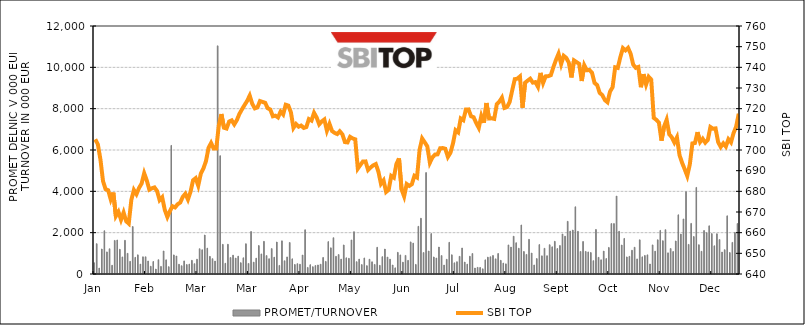
| Category | PROMET/TURNOVER |
|---|---|
| 2016-01-04 | 547 |
| 2016-01-05 | 1467 |
| 2016-01-06 | 286 |
| 2016-01-07 | 1211 |
| 2016-01-08 | 2095 |
| 2016-01-11 | 1070 |
| 2016-01-12 | 1221 |
| 2016-01-13 | 424 |
| 2016-01-14 | 1624 |
| 2016-01-15 | 1646 |
| 2016-01-18 | 1197 |
| 2016-01-19 | 827 |
| 2016-01-20 | 1630 |
| 2016-01-21 | 999 |
| 2016-01-22 | 612 |
| 2016-01-25 | 2298 |
| 2016-01-26 | 805 |
| 2016-01-27 | 927 |
| 2016-01-28 | 478 |
| 2016-01-29 | 833 |
| 2016-02-01 | 832 |
| 2016-02-02 | 630 |
| 2016-02-03 | 375 |
| 2016-02-04 | 604 |
| 2016-02-05 | 239 |
| 2016-02-09 | 692 |
| 2016-02-10 | 368 |
| 2016-02-11 | 1114 |
| 2016-02-12 | 686 |
| 2016-02-15 | 356 |
| 2016-02-16 | 6221 |
| 2016-02-17 | 924 |
| 2016-02-18 | 871 |
| 2016-02-19 | 473 |
| 2016-02-22 | 400 |
| 2016-02-23 | 634 |
| 2016-02-24 | 457 |
| 2016-02-25 | 479 |
| 2016-02-26 | 662 |
| 2016-02-29 | 500 |
| 2016-03-01 | 717 |
| 2016-03-02 | 1223 |
| 2016-03-03 | 1173 |
| 2016-03-04 | 1887 |
| 2016-03-07 | 1252 |
| 2016-03-08 | 853 |
| 2016-03-09 | 743 |
| 2016-03-10 | 625 |
| 2016-03-11 | 11040 |
| 2016-03-14 | 5723 |
| 2016-03-15 | 1435 |
| 2016-03-16 | 519 |
| 2016-03-17 | 1440 |
| 2016-03-18 | 798 |
| 2016-03-21 | 913 |
| 2016-03-22 | 770 |
| 2016-03-23 | 864 |
| 2016-03-24 | 548 |
| 2016-03-29 | 784 |
| 2016-03-30 | 1465 |
| 2016-03-31 | 511 |
| 2016-04-01 | 2057 |
| 2016-04-04 | 574 |
| 2016-04-05 | 767 |
| 2016-04-06 | 1377 |
| 2016-04-07 | 972 |
| 2016-04-08 | 1580 |
| 2016-04-11 | 891 |
| 2016-04-12 | 739 |
| 2016-04-13 | 1229 |
| 2016-04-14 | 812 |
| 2016-04-15 | 1549 |
| 2016-04-18 | 416 |
| 2016-04-19 | 1605 |
| 2016-04-20 | 640 |
| 2016-04-21 | 826 |
| 2016-04-22 | 1526 |
| 2016-04-25 | 734 |
| 2016-04-26 | 461 |
| 2016-04-28 | 501 |
| 2016-04-29 | 472 |
| 2016-05-03 | 918 |
| 2016-05-04 | 2141 |
| 2016-05-05 | 319 |
| 2016-05-06 | 451 |
| 2016-05-09 | 354 |
| 2016-05-10 | 410 |
| 2016-05-11 | 437 |
| 2016-05-12 | 473 |
| 2016-05-13 | 800 |
| 2016-05-16 | 610 |
| 2016-05-17 | 1567 |
| 2016-05-18 | 1267 |
| 2016-05-19 | 1756 |
| 2016-05-20 | 855 |
| 2016-05-23 | 940 |
| 2016-05-24 | 721 |
| 2016-05-25 | 1406 |
| 2016-05-26 | 784 |
| 2016-05-27 | 759 |
| 2016-05-30 | 1647 |
| 2016-05-31 | 2048 |
| 2016-06-01 | 597 |
| 2016-06-02 | 721 |
| 2016-06-03 | 455 |
| 2016-06-06 | 777 |
| 2016-06-07 | 405 |
| 2016-06-08 | 714 |
| 2016-06-09 | 590 |
| 2016-06-10 | 464 |
| 2016-06-13 | 1293 |
| 2016-06-14 | 419 |
| 2016-06-15 | 838 |
| 2016-06-16 | 1207 |
| 2016-06-17 | 820 |
| 2016-06-20 | 718 |
| 2016-06-21 | 436 |
| 2016-06-22 | 297 |
| 2016-06-23 | 1048 |
| 2016-06-24 | 923 |
| 2016-06-27 | 573 |
| 2016-06-28 | 900 |
| 2016-06-29 | 660 |
| 2016-06-30 | 1554 |
| 2016-07-01 | 1493 |
| 2016-07-04 | 464 |
| 2016-07-05 | 2307 |
| 2016-07-06 | 2698 |
| 2016-07-07 | 1037 |
| 2016-07-08 | 4907 |
| 2016-07-11 | 1113 |
| 2016-07-12 | 1954 |
| 2016-07-13 | 825 |
| 2016-07-14 | 773 |
| 2016-07-15 | 1304 |
| 2016-07-18 | 891 |
| 2016-07-19 | 433 |
| 2016-07-20 | 712 |
| 2016-07-21 | 1533 |
| 2016-07-22 | 930 |
| 2016-07-25 | 541 |
| 2016-07-26 | 594 |
| 2016-07-27 | 855 |
| 2016-07-28 | 1259 |
| 2016-07-29 | 577 |
| 2016-08-01 | 476 |
| 2016-08-02 | 859 |
| 2016-08-03 | 991 |
| 2016-08-04 | 290 |
| 2016-08-05 | 322 |
| 2016-08-08 | 317 |
| 2016-08-09 | 250 |
| 2016-08-10 | 685 |
| 2016-08-11 | 816 |
| 2016-08-12 | 835 |
| 2016-08-16 | 897 |
| 2016-08-17 | 732 |
| 2016-08-18 | 992 |
| 2016-08-19 | 661 |
| 2016-08-22 | 528 |
| 2016-08-23 | 490 |
| 2016-08-24 | 1407 |
| 2016-08-25 | 1301 |
| 2016-08-26 | 1827 |
| 2016-08-29 | 1513 |
| 2016-08-30 | 1247 |
| 2016-08-31 | 2372 |
| 2016-09-01 | 1089 |
| 2016-09-02 | 948 |
| 2016-09-05 | 1677 |
| 2016-09-06 | 1014 |
| 2016-09-07 | 437 |
| 2016-09-08 | 747 |
| 2016-09-09 | 1423 |
| 2016-09-12 | 879 |
| 2016-09-13 | 1243 |
| 2016-09-14 | 884 |
| 2016-09-15 | 1418 |
| 2016-09-16 | 1315 |
| 2016-09-19 | 1582 |
| 2016-09-20 | 1232 |
| 2016-09-21 | 1378 |
| 2016-09-22 | 1936 |
| 2016-09-23 | 1831 |
| 2016-09-26 | 2549 |
| 2016-09-27 | 2077 |
| 2016-09-28 | 2128 |
| 2016-09-29 | 3252 |
| 2016-09-30 | 2064 |
| 2016-10-03 | 1091 |
| 2016-10-04 | 1573 |
| 2016-10-05 | 1093 |
| 2016-10-06 | 1068 |
| 2016-10-07 | 1039 |
| 2016-10-10 | 645 |
| 2016-10-11 | 2156 |
| 2016-10-12 | 806 |
| 2016-10-13 | 686 |
| 2016-10-14 | 1107 |
| 2016-10-17 | 746 |
| 2016-10-18 | 1286 |
| 2016-10-19 | 2441 |
| 2016-10-20 | 2439 |
| 2016-10-21 | 3771 |
| 2016-10-24 | 2068 |
| 2016-10-25 | 1403 |
| 2016-10-26 | 1721 |
| 2016-10-27 | 827 |
| 2016-10-28 | 854 |
| 2016-11-02 | 1150 |
| 2016-11-03 | 1295 |
| 2016-11-04 | 730 |
| 2016-11-07 | 1654 |
| 2016-11-08 | 831 |
| 2016-11-09 | 899 |
| 2016-11-10 | 926 |
| 2016-11-11 | 484 |
| 2016-11-14 | 1409 |
| 2016-11-15 | 1105 |
| 2016-11-16 | 1656 |
| 2016-11-17 | 2110 |
| 2016-11-18 | 1612 |
| 2016-11-21 | 2145 |
| 2016-11-22 | 1023 |
| 2016-11-23 | 1232 |
| 2016-11-24 | 1088 |
| 2016-11-25 | 1598 |
| 2016-11-28 | 2864 |
| 2016-11-29 | 1930 |
| 2016-11-30 | 2664 |
| 2016-12-01 | 3985 |
| 2016-12-02 | 1433 |
| 2016-12-05 | 2449 |
| 2016-12-06 | 1814 |
| 2016-12-07 | 4190 |
| 2016-12-08 | 1417 |
| 2016-12-09 | 1100 |
| 2016-12-12 | 2104 |
| 2016-12-13 | 2000 |
| 2016-12-14 | 2332 |
| 2016-12-15 | 1955 |
| 2016-12-16 | 1364 |
| 2016-12-19 | 1948 |
| 2016-12-20 | 1667 |
| 2016-12-21 | 1062 |
| 2016-12-22 | 1175 |
| 2016-12-23 | 2815 |
| 2016-12-27 | 1041 |
| 2016-12-28 | 1530 |
| 2016-12-29 | 2014 |
| 2016-12-30 | 2442 |